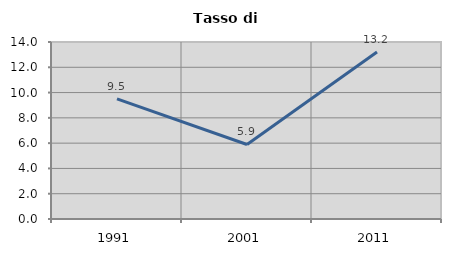
| Category | Tasso di disoccupazione   |
|---|---|
| 1991.0 | 9.504 |
| 2001.0 | 5.895 |
| 2011.0 | 13.216 |